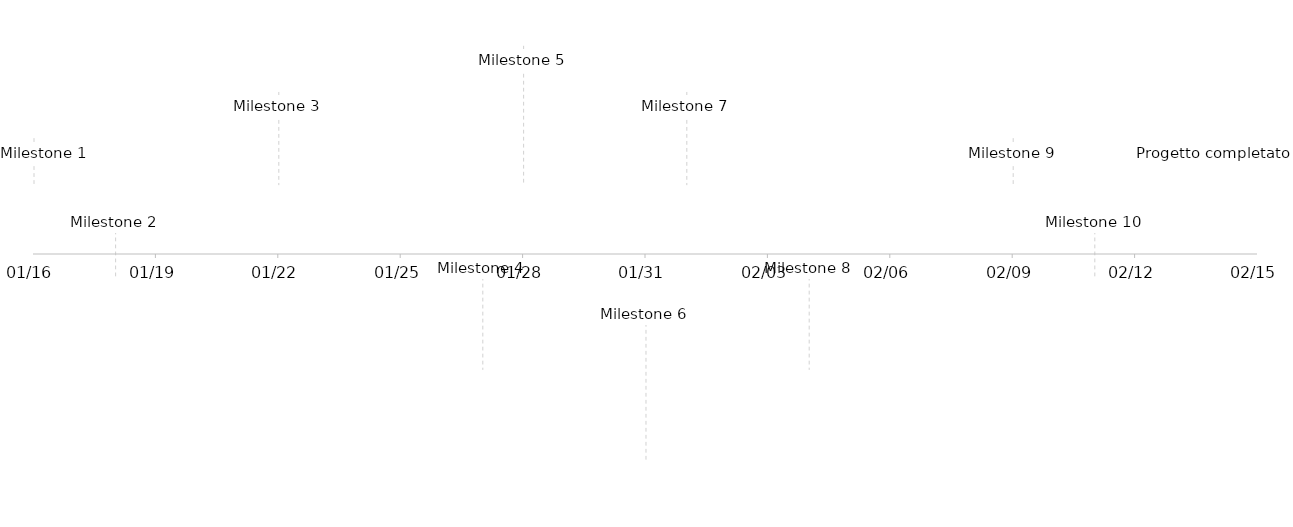
| Category | Series 1 |
|---|---|
| Milestone 1 | 5 |
| Milestone 2 | -5 |
| Milestone 3 | 10 |
| Milestone 4 | -10 |
| Milestone 5 | 15 |
| Milestone 6 | -15 |
| Milestone 7 | 10 |
| Milestone 8 | -10 |
| Milestone 9 | 5 |
| Milestone 10 | -5 |
| Progetto completato | 5 |